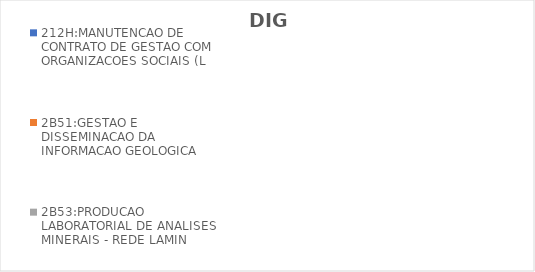
| Category | 212H:MANUTENCAO DE CONTRATO DE GESTAO COM ORGANIZACOES SOCIAIS (L | 2B51:GESTAO E DISSEMINACAO DA INFORMACAO GEOLOGICA | 2B53:PRODUCAO LABORATORIAL DE ANALISES MINERAIS - REDE LAMIN |
|---|---|---|---|
| EXECUTADO | 0 | 0.66 | 0.325 |